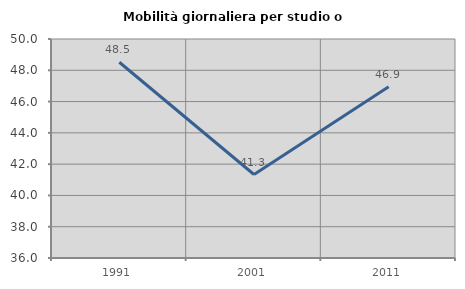
| Category | Mobilità giornaliera per studio o lavoro |
|---|---|
| 1991.0 | 48.514 |
| 2001.0 | 41.336 |
| 2011.0 | 46.946 |